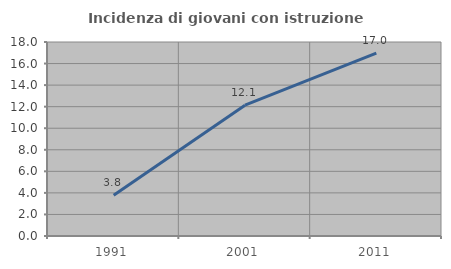
| Category | Incidenza di giovani con istruzione universitaria |
|---|---|
| 1991.0 | 3.785 |
| 2001.0 | 12.136 |
| 2011.0 | 16.97 |